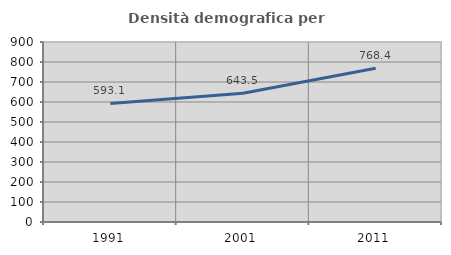
| Category | Densità demografica |
|---|---|
| 1991.0 | 593.07 |
| 2001.0 | 643.531 |
| 2011.0 | 768.417 |